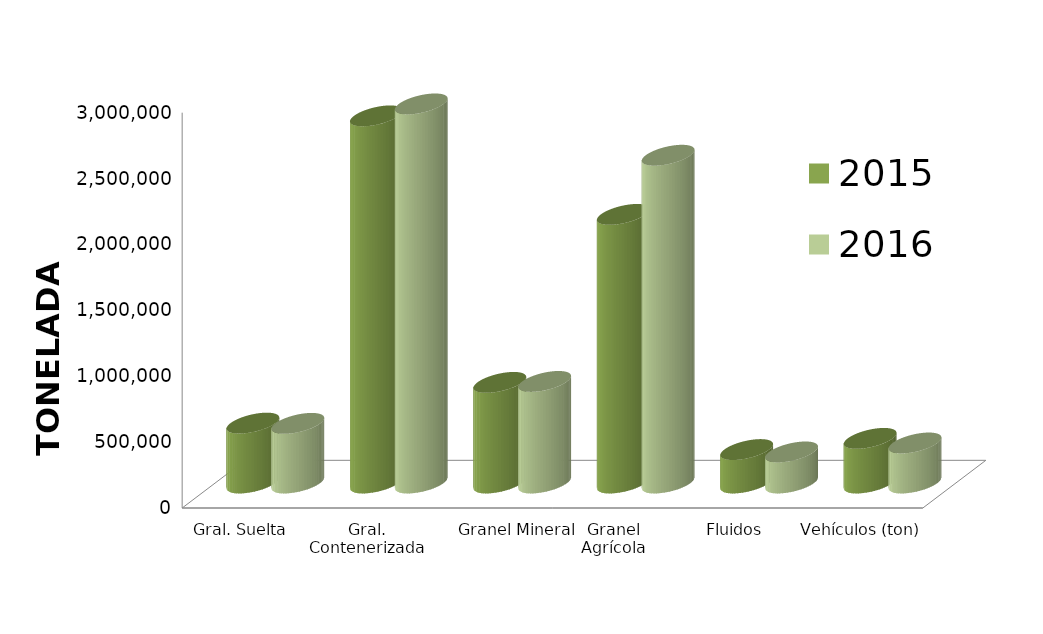
| Category | 2015 | 2016 |
|---|---|---|
| Gral. Suelta | 454358.252 | 452469.011 |
| Gral. Contenerizada | 2785957.754 | 2876585.618 |
| Granel Mineral | 763465.41 | 770744.244 |
| Granel Agrícola | 2038300.59 | 2487190.584 |
| Fluidos | 253687.079 | 235646.461 |
| Vehículos (ton) | 338475.287 | 303617.033 |